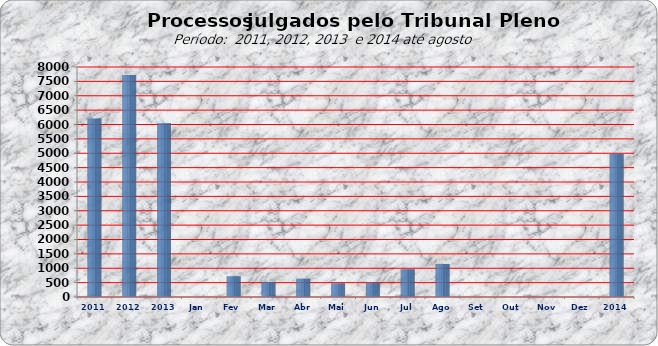
| Category | 6205 7722 6043 0 721 524 638 481 496 969 1152 0 0 0 0 |
|---|---|
| 2011 | 6205 |
| 2012 | 7722 |
| 2013 | 6043 |
| Jan | 0 |
| Fev | 721 |
| Mar | 524 |
| Abr | 638 |
| Mai | 481 |
| Jun | 496 |
| Jul | 969 |
| Ago | 1152 |
| Set | 0 |
| Out | 0 |
| Nov | 0 |
| Dez | 0 |
| 2014 | 4981 |